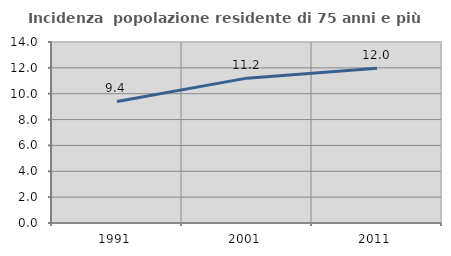
| Category | Incidenza  popolazione residente di 75 anni e più |
|---|---|
| 1991.0 | 9.401 |
| 2001.0 | 11.205 |
| 2011.0 | 11.974 |